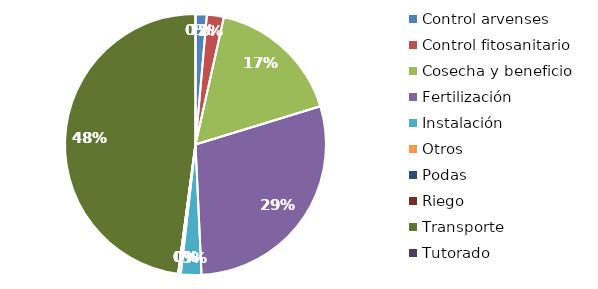
| Category | Valor |
|---|---|
| Control arvenses | 1212542 |
| Control fitosanitario | 1828401 |
| Cosecha y beneficio | 14595284.015 |
| Fertilización | 25234674.021 |
| Instalación | 2206133.315 |
| Otros | 280679 |
| Podas | 0 |
| Riego | 0 |
| Transporte | 41665168 |
| Tutorado | 0 |